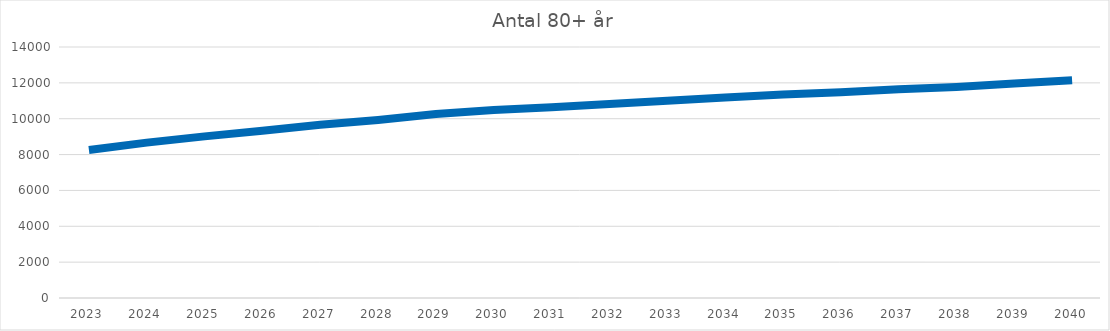
| Category | Antal 80+ år |
|---|---|
| 2023.0 | 8251 |
| 2024.0 | 8667.605 |
| 2025.0 | 9014.056 |
| 2026.0 | 9326.426 |
| 2027.0 | 9664.517 |
| 2028.0 | 9931.431 |
| 2029.0 | 10256.792 |
| 2030.0 | 10480.864 |
| 2031.0 | 10642.208 |
| 2032.0 | 10826.715 |
| 2033.0 | 11006.195 |
| 2034.0 | 11176.873 |
| 2035.0 | 11354.022 |
| 2036.0 | 11478.415 |
| 2037.0 | 11643.84 |
| 2038.0 | 11767.661 |
| 2039.0 | 11961.118 |
| 2040.0 | 12145.262 |